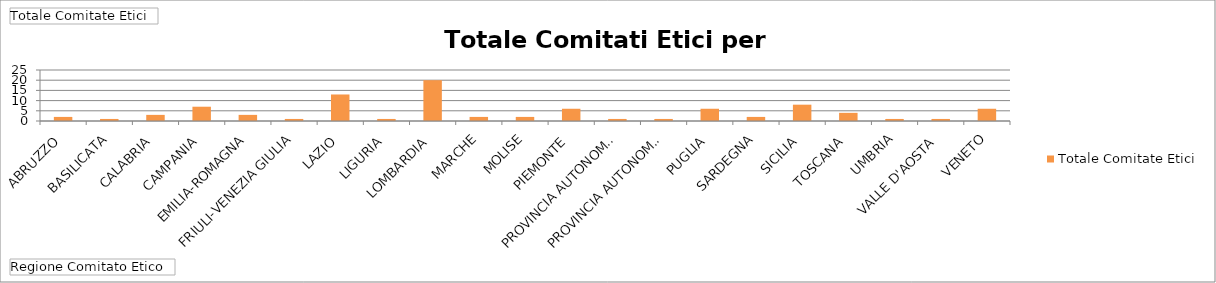
| Category | Totale |
|---|---|
| ABRUZZO | 2 |
| BASILICATA | 1 |
| CALABRIA | 3 |
| CAMPANIA | 7 |
| EMILIA-ROMAGNA | 3 |
| FRIULI-VENEZIA GIULIA | 1 |
| LAZIO | 13 |
| LIGURIA | 1 |
| LOMBARDIA | 20 |
| MARCHE | 2 |
| MOLISE | 2 |
| PIEMONTE | 6 |
| PROVINCIA AUTONOMA DI BOLZANO | 1 |
| PROVINCIA AUTONOMA DI TRENTO | 1 |
| PUGLIA | 6 |
| SARDEGNA | 2 |
| SICILIA | 8 |
| TOSCANA | 4 |
| UMBRIA | 1 |
| VALLE D'AOSTA | 1 |
| VENETO | 6 |